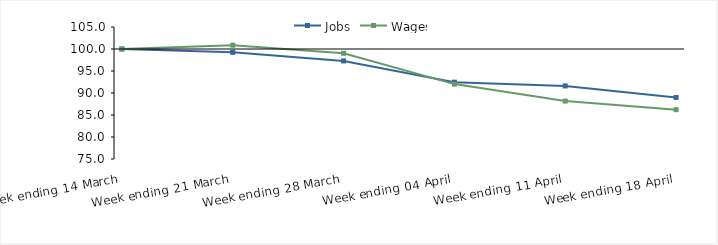
| Category | Jobs | Wages |
|---|---|---|
| 0 | 100 | 100 |
| 1900-01-01 | 99.242 | 100.86 |
| 1900-01-02 | 97.285 | 99.027 |
| 1900-01-03 | 92.453 | 92.024 |
| 1900-01-04 | 91.61 | 88.159 |
| 1900-01-05 | 88.987 | 86.211 |